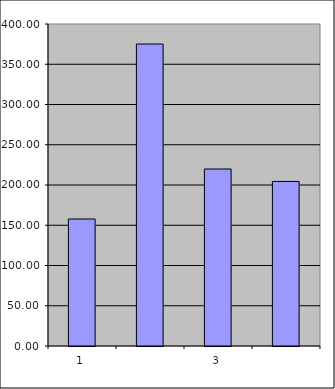
| Category | Series 0 |
|---|---|
| 0 | 157.75 |
| 1 | 375.126 |
| 2 | 219.866 |
| 3 | 204.427 |